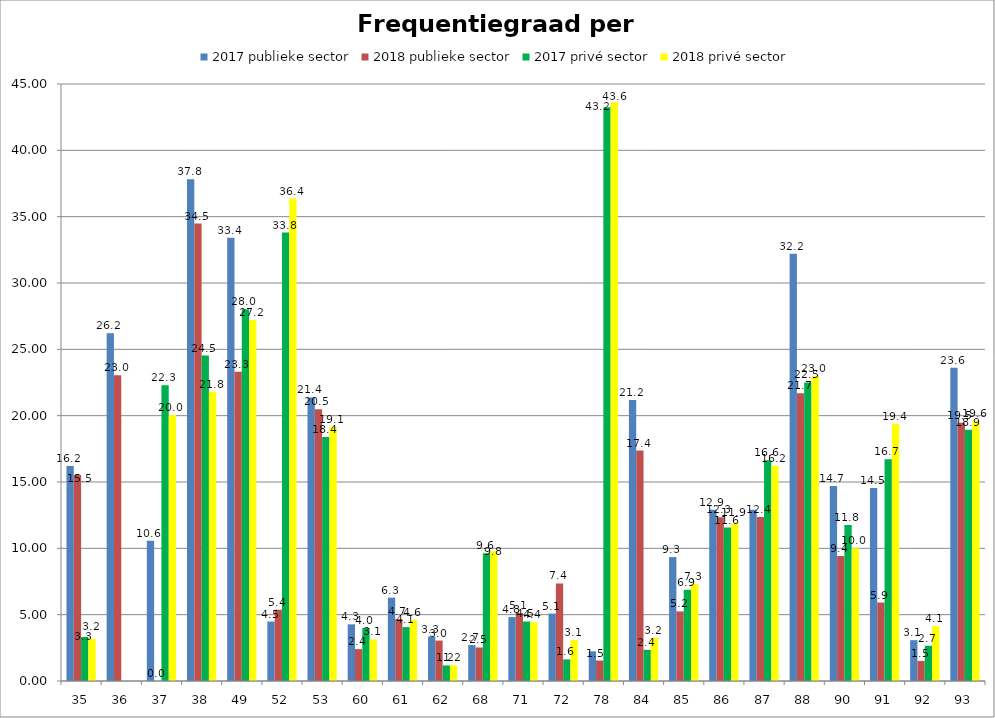
| Category | 2017 publieke sector | 2018 publieke sector | 2017 privé sector | 2018 privé sector |
|---|---|---|---|---|
| 35 | 16.197 | 15.52 | 3.324 | 3.174 |
| 36 | 26.203 | 23.04 | 0 | 0 |
| 37 | 10.573 | 0 | 22.29 | 20.05 |
| 38 | 37.816 | 34.48 | 24.535 | 21.796 |
| 49 | 33.407 | 23.301 | 28.027 | 27.205 |
| 52 | 4.483 | 5.372 | 33.804 | 36.364 |
| 53 | 21.375 | 20.475 | 18.392 | 19.148 |
| 60 | 4.272 | 2.403 | 3.999 | 3.135 |
| 61 | 6.284 | 4.66 | 4.063 | 4.597 |
| 62 | 3.349 | 3.047 | 1.172 | 1.184 |
| 68 | 2.705 | 2.525 | 9.635 | 9.787 |
| 71 | 4.819 | 5.124 | 4.485 | 4.415 |
| 72 | 5.083 | 7.354 | 1.628 | 3.089 |
| 78 | 2.235 | 1.546 | 43.248 | 43.627 |
| 84 | 21.172 | 17.369 | 2.353 | 3.247 |
| 85 | 9.341 | 5.245 | 6.872 | 7.327 |
| 86 | 12.899 | 12.337 | 11.565 | 11.867 |
| 87 | 12.909 | 12.359 | 16.646 | 16.216 |
| 88 | 32.199 | 21.683 | 22.505 | 22.975 |
| 90 | 14.691 | 9.419 | 11.758 | 10.008 |
| 91 | 14.549 | 5.916 | 16.713 | 19.395 |
| 92 | 3.078 | 1.515 | 2.657 | 4.142 |
| 93 | 23.603 | 19.472 | 18.936 | 19.562 |